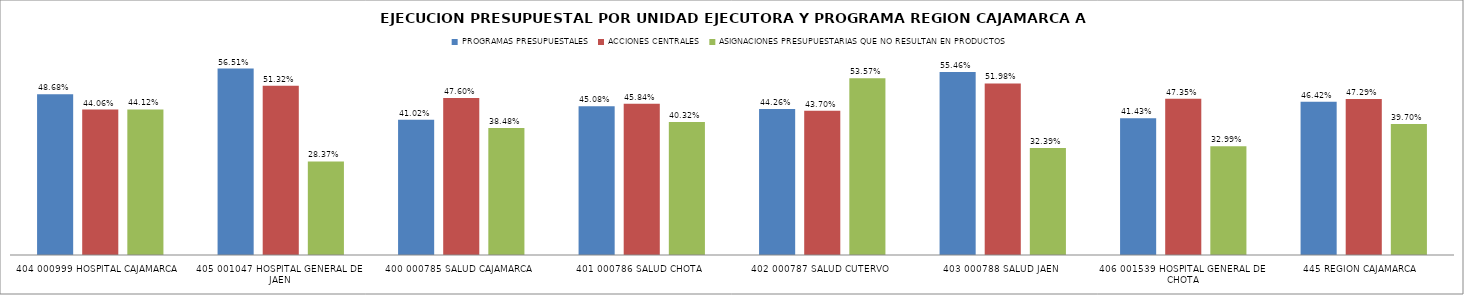
| Category | PROGRAMAS PRESUPUESTALES | ACCIONES CENTRALES | ASIGNACIONES PRESUPUESTARIAS QUE NO RESULTAN EN PRODUCTOS |
|---|---|---|---|
| 404 000999 HOSPITAL CAJAMARCA | 0.487 | 0.441 | 0.441 |
| 405 001047 HOSPITAL GENERAL DE JAEN | 0.565 | 0.513 | 0.284 |
| 400 000785 SALUD CAJAMARCA | 0.41 | 0.476 | 0.385 |
| 401 000786 SALUD CHOTA | 0.451 | 0.458 | 0.403 |
| 402 000787 SALUD CUTERVO | 0.443 | 0.437 | 0.536 |
| 403 000788 SALUD JAEN | 0.555 | 0.52 | 0.324 |
| 406 001539 HOSPITAL GENERAL DE CHOTA | 0.414 | 0.474 | 0.33 |
| 445 REGION CAJAMARCA | 0.464 | 0.473 | 0.397 |